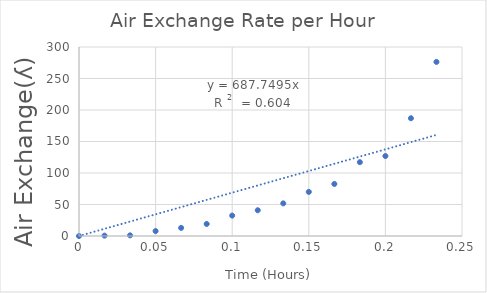
| Category | Series 0 |
|---|---|
| 0.0 | 0 |
| 0.016666666666666666 | 0.584 |
| 0.03333333333333333 | 1.04 |
| 0.05 | 7.817 |
| 0.06666666666666667 | 12.847 |
| 0.08333333333333333 | 19.107 |
| 0.1 | 32.444 |
| 0.11666666666666667 | 40.862 |
| 0.13333333333333333 | 51.757 |
| 0.15 | 69.988 |
| 0.16666666666666666 | 82.599 |
| 0.18333333333333332 | 117.187 |
| 0.2 | 126.923 |
| 0.21666666666666667 | 186.923 |
| 0.23333333333333334 | 276.329 |